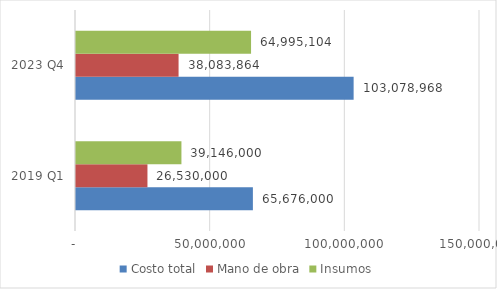
| Category | Costo total | Mano de obra | Insumos |
|---|---|---|---|
| 2019 Q1 | 65676000 | 26530000 | 39146000 |
| 2023 Q4 | 103078968.213 | 38083864 | 64995104.213 |